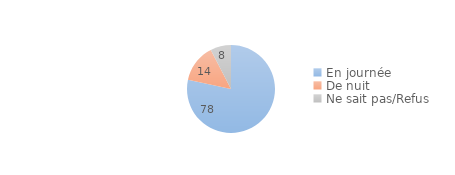
| Category | Series 0 |
|---|---|
| En journée | 78.354 |
| De nuit | 14.073 |
| Ne sait pas/Refus | 7.573 |